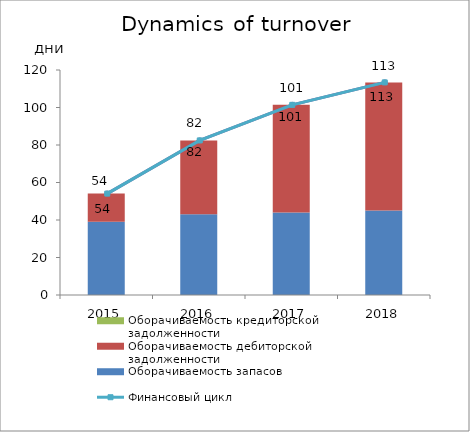
| Category | Оборачиваемость запасов | Оборачиваемость дебиторской задолженности | Оборачиваемость кредиторской задолженности |
|---|---|---|---|
| 2015.0 | 39.116 | 14.971 | 0 |
| 2016.0 | 43.04 | 39.403 | 0 |
| 2017.0 | 44.011 | 57.406 | 0 |
| 2018.0 | 45.026 | 68.367 | 0 |